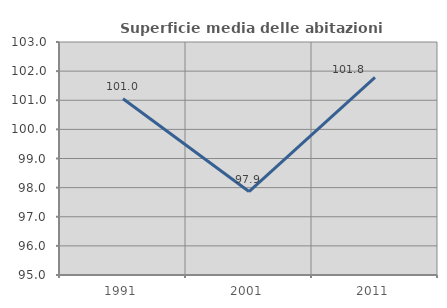
| Category | Superficie media delle abitazioni occupate |
|---|---|
| 1991.0 | 101.049 |
| 2001.0 | 97.864 |
| 2011.0 | 101.787 |